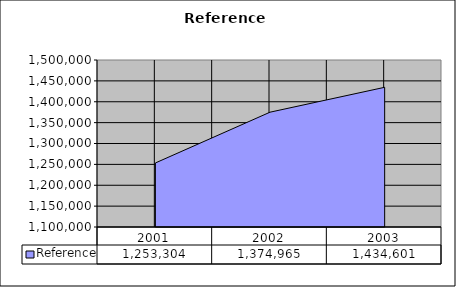
| Category | Reference |
|---|---|
| 2001.0 | 1253304 |
| 2002.0 | 1374965 |
| 2003.0 | 1434601 |